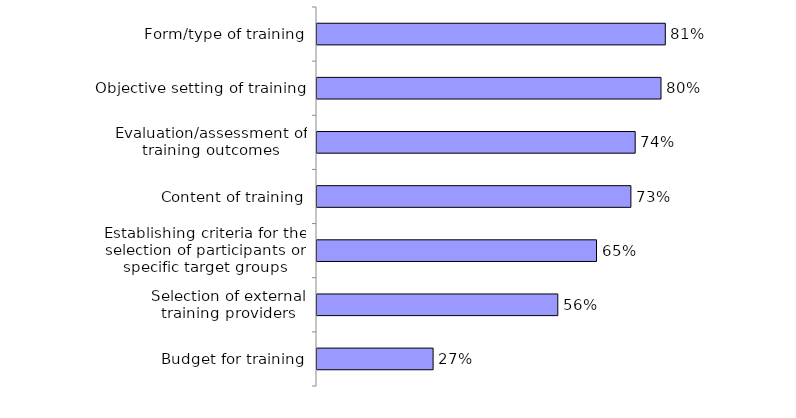
| Category | Series 0 |
|---|---|
| Form/type of training | 0.81 |
| Objective setting of training | 0.8 |
| Evaluation/assessment of training outcomes | 0.74 |
| Content of training | 0.73 |
| Establishing criteria for the selection of participants or specific target groups | 0.65 |
| Selection of external training providers | 0.56 |
| Budget for training | 0.27 |